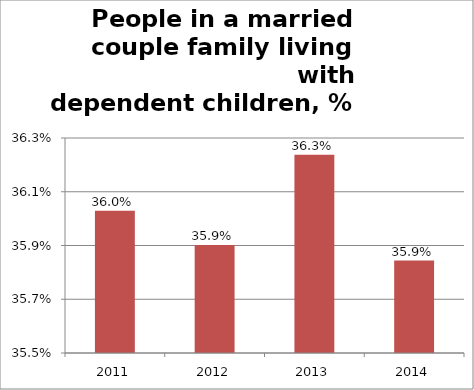
| Category | Series 1 |
|---|---|
| 2011.0 | 0.36 |
| 2012.0 | 0.359 |
| 2013.0 | 0.363 |
| 2014.0 | 0.359 |